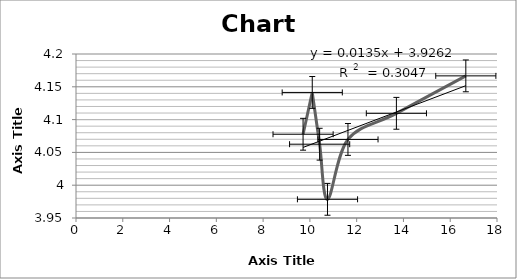
| Category | Series 0 |
|---|---|
| 16.666666666666668 | 4.167 |
| 13.698630136986303 | 4.11 |
| 11.627906976744185 | 4.07 |
| 10.752688172043012 | 3.978 |
| 10.416666666666668 | 4.063 |
| 10.101010101010102 | 4.141 |
| 9.708737864077671 | 4.078 |